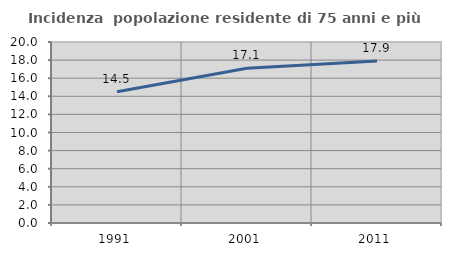
| Category | Incidenza  popolazione residente di 75 anni e più |
|---|---|
| 1991.0 | 14.505 |
| 2001.0 | 17.1 |
| 2011.0 | 17.91 |